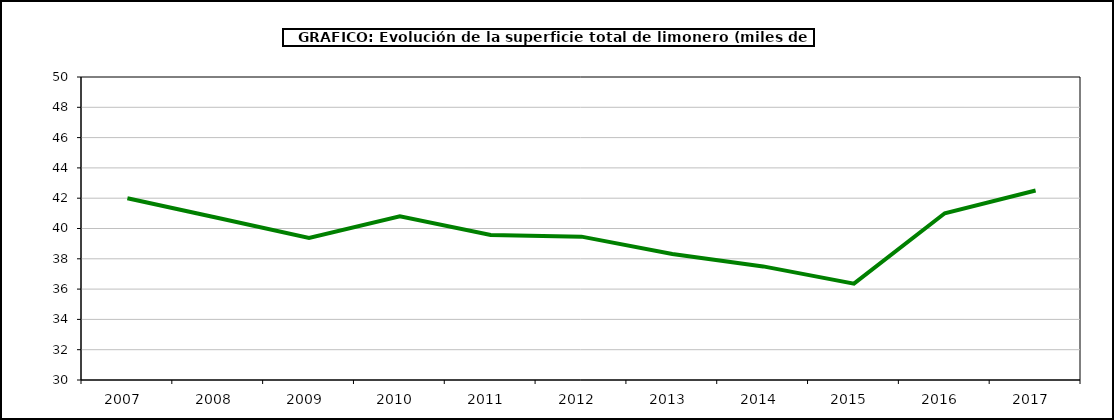
| Category | superficie |
|---|---|
| 2007.0 | 41.996 |
| 2008.0 | 40.689 |
| 2009.0 | 39.371 |
| 2010.0 | 40.801 |
| 2011.0 | 39.571 |
| 2012.0 | 39.463 |
| 2013.0 | 38.319 |
| 2014.0 | 37.498 |
| 2015.0 | 36.363 |
| 2016.0 | 41.009 |
| 2017.0 | 42.507 |